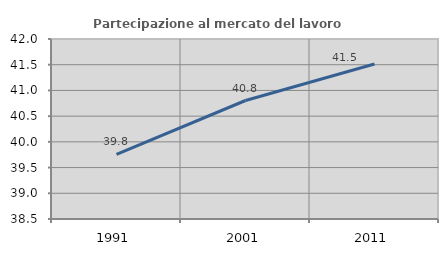
| Category | Partecipazione al mercato del lavoro  femminile |
|---|---|
| 1991.0 | 39.755 |
| 2001.0 | 40.804 |
| 2011.0 | 41.513 |